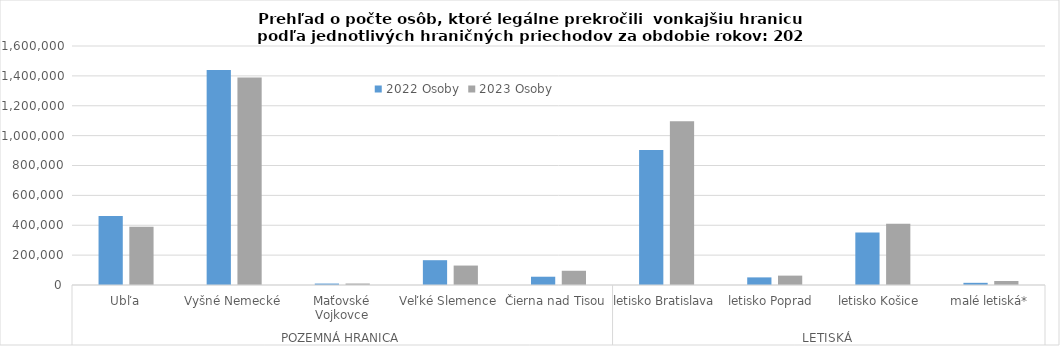
| Category | 2022 | 2023 |
|---|---|---|
| 0 | 462419 | 390020 |
| 1 | 1438916 | 1389005 |
| 2 | 9697 | 9991 |
| 3 | 166037 | 130139 |
| 4 | 55411 | 95257 |
| 5 | 904366 | 1095819 |
| 6 | 50948 | 62770 |
| 7 | 350898 | 409528 |
| 8 | 14586 | 26982 |